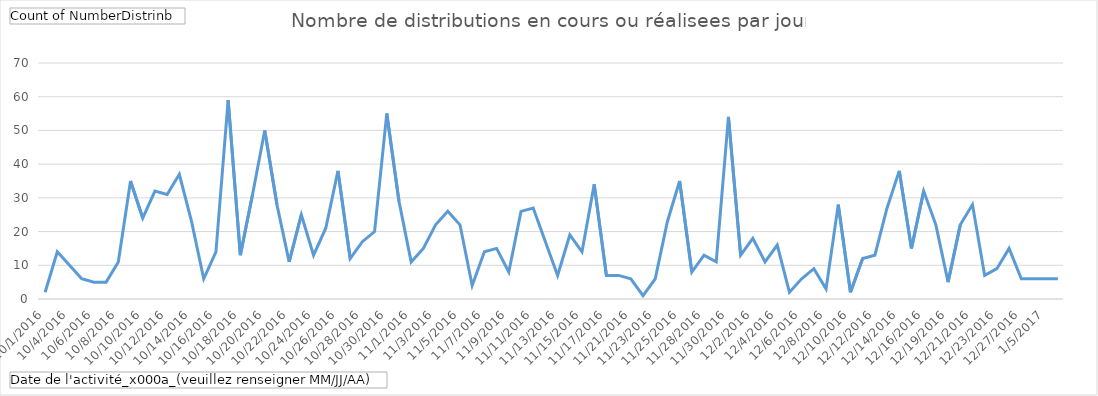
| Category | Total |
|---|---|
| 10/1/2016 | 2 |
| 10/2/2016 | 14 |
| 10/4/2016 | 10 |
| 10/5/2016 | 6 |
| 10/6/2016 | 5 |
| 10/7/2016 | 5 |
| 10/8/2016 | 11 |
| 10/9/2016 | 35 |
| 10/10/2016 | 24 |
| 10/11/2016 | 32 |
| 10/12/2016 | 31 |
| 10/13/2016 | 37 |
| 10/14/2016 | 23 |
| 10/15/2016 | 6 |
| 10/16/2016 | 14 |
| 10/17/2016 | 59 |
| 10/18/2016 | 13 |
| 10/19/2016 | 31 |
| 10/20/2016 | 50 |
| 10/21/2016 | 28 |
| 10/22/2016 | 11 |
| 10/23/2016 | 25 |
| 10/24/2016 | 13 |
| 10/25/2016 | 21 |
| 10/26/2016 | 38 |
| 10/27/2016 | 12 |
| 10/28/2016 | 17 |
| 10/29/2016 | 20 |
| 10/30/2016 | 55 |
| 10/31/2016 | 29 |
| 11/1/2016 | 11 |
| 11/2/2016 | 15 |
| 11/3/2016 | 22 |
| 11/4/2016 | 26 |
| 11/5/2016 | 22 |
| 11/6/2016 | 4 |
| 11/7/2016 | 14 |
| 11/8/2016 | 15 |
| 11/9/2016 | 8 |
| 11/10/2016 | 26 |
| 11/11/2016 | 27 |
| 11/12/2016 | 17 |
| 11/13/2016 | 7 |
| 11/14/2016 | 19 |
| 11/15/2016 | 14 |
| 11/16/2016 | 34 |
| 11/17/2016 | 7 |
| 11/19/2016 | 7 |
| 11/21/2016 | 6 |
| 11/22/2016 | 1 |
| 11/23/2016 | 6 |
| 11/24/2016 | 23 |
| 11/25/2016 | 35 |
| 11/26/2016 | 8 |
| 11/28/2016 | 13 |
| 11/29/2016 | 11 |
| 11/30/2016 | 54 |
| 12/1/2016 | 13 |
| 12/2/2016 | 18 |
| 12/3/2016 | 11 |
| 12/4/2016 | 16 |
| 12/5/2016 | 2 |
| 12/6/2016 | 6 |
| 12/7/2016 | 9 |
| 12/8/2016 | 3 |
| 12/9/2016 | 28 |
| 12/10/2016 | 2 |
| 12/11/2016 | 12 |
| 12/12/2016 | 13 |
| 12/13/2016 | 27 |
| 12/14/2016 | 38 |
| 12/15/2016 | 15 |
| 12/16/2016 | 32 |
| 12/17/2016 | 22 |
| 12/19/2016 | 5 |
| 12/20/2016 | 22 |
| 12/21/2016 | 28 |
| 12/22/2016 | 7 |
| 12/23/2016 | 9 |
| 12/24/2016 | 15 |
| 12/27/2016 | 6 |
| 12/30/2016 | 6 |
| 1/5/2017 | 6 |
| 1/6/2017 | 6 |